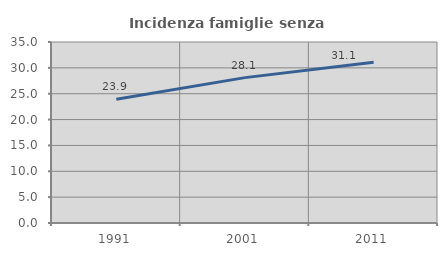
| Category | Incidenza famiglie senza nuclei |
|---|---|
| 1991.0 | 23.929 |
| 2001.0 | 28.109 |
| 2011.0 | 31.083 |